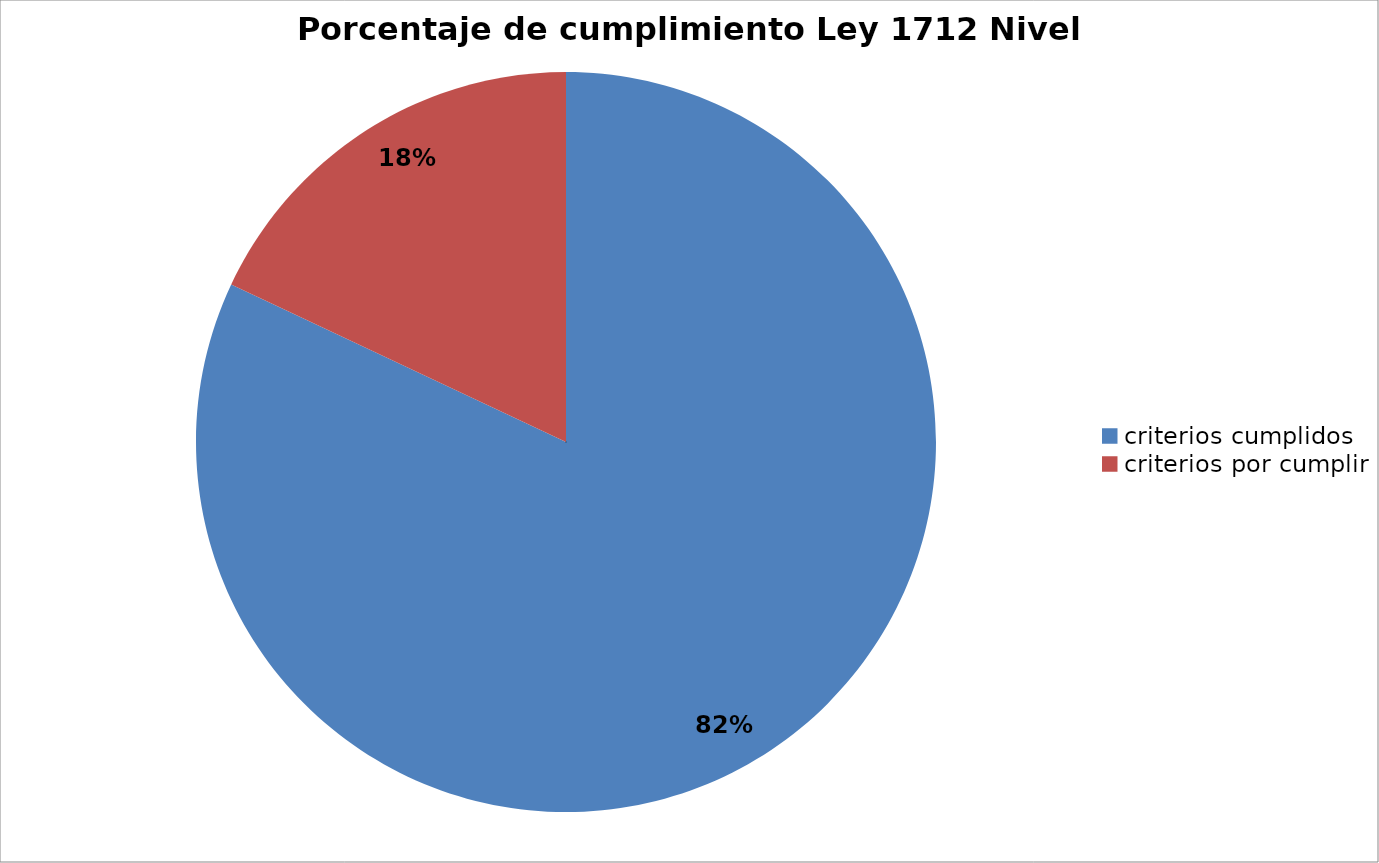
| Category | Series 0 |
|---|---|
| criterios cumplidos | 123 |
| criterios por cumplir | 27 |